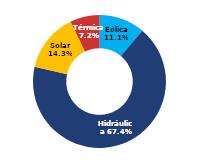
| Category | Sur |
|---|---|
| Eólica | 58.578 |
| Hidráulica | 354.135 |
| Solar | 75.156 |
| Térmica | 37.615 |